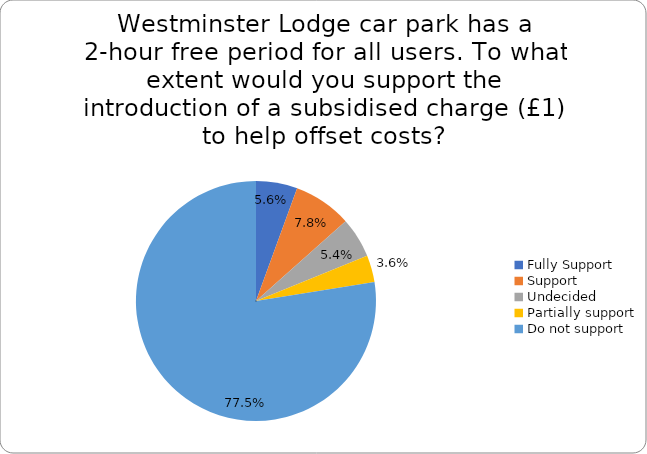
| Category | Series 0 |
|---|---|
| Fully Support | 0.056 |
| Support | 0.078 |
| Undecided | 0.054 |
| Partially support | 0.036 |
| Do not support | 0.775 |